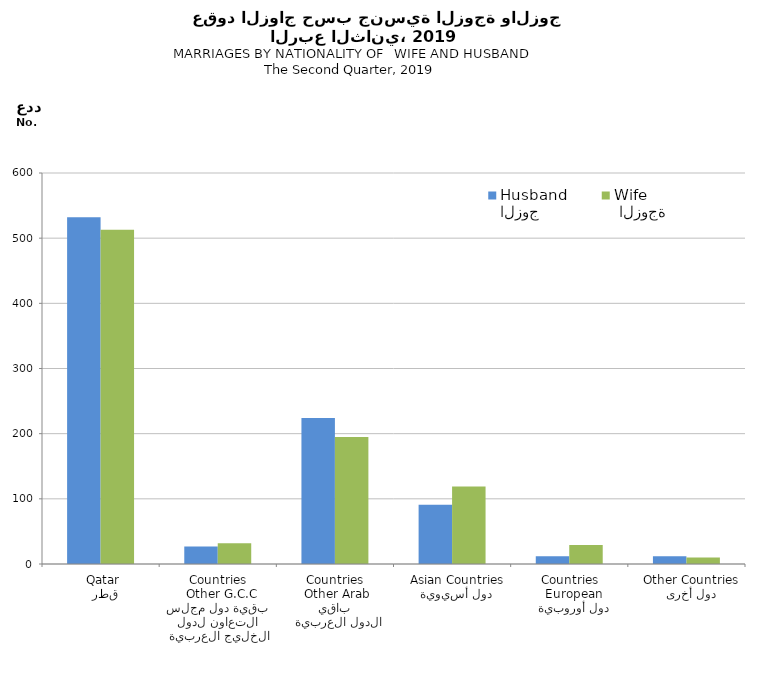
| Category | الزوج
Husband |  الزوجة
Wife |
|---|---|---|
|   قطر
 Qatar | 532 | 513 |
|  بقية دول مجلس التعاون لدول الخليج العربية
  Other G.C.C Countries | 27 | 32 |
|   باقي الدول العربية
 Other Arab Countries | 224 | 195 |
|   دول أسيوية
  Asian Countries | 91 | 119 |
|   دول أوروبية
  European Countries | 12 | 29 |
|   دول أخرى
  Other Countries | 12 | 10 |